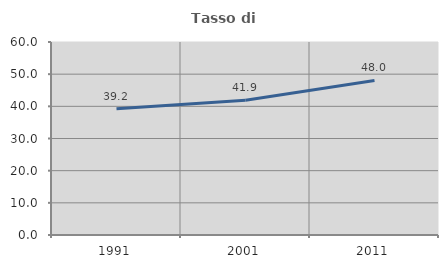
| Category | Tasso di occupazione   |
|---|---|
| 1991.0 | 39.241 |
| 2001.0 | 41.922 |
| 2011.0 | 48.049 |